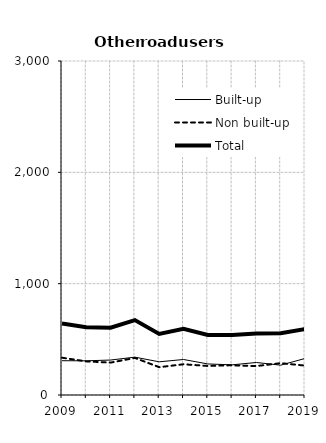
| Category | Built-up | Non built-up | Total |
|---|---|---|---|
| 2009.0 | 308 | 335 | 643 |
| 2010.0 | 307 | 302 | 609 |
| 2011.0 | 314 | 291 | 605 |
| 2012.0 | 340 | 333 | 673 |
| 2013.0 | 298 | 250 | 548 |
| 2014.0 | 319 | 276 | 595 |
| 2015.0 | 279 | 261 | 540 |
| 2016.0 | 271 | 267 | 538 |
| 2017.0 | 292 | 260 | 552 |
| 2018.0 | 268 | 286 | 554 |
| 2019.0 | 328 | 264 | 592 |